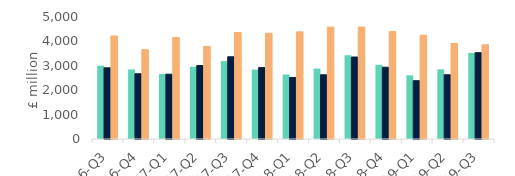
| Category | First-time
buyers | Homemovers | Homowner remortgaging |
|---|---|---|---|
| 16-Q3 | 3006.478 | 2917.918 | 4221.741 |
| 16-Q4 | 2852.368 | 2673.268 | 3658.031 |
| 17-Q1 | 2663.765 | 2655.634 | 4162.385 |
| 17-Q2 | 2962.37 | 3010.336 | 3795.665 |
| 17-Q3 | 3191.685 | 3369.738 | 4363.799 |
| 17-Q4 | 2846.023 | 2926.855 | 4332.96 |
| 18-Q1 | 2642.609 | 2523.005 | 4392.455 |
| 18-Q2 | 2887.583 | 2632.429 | 4586.261 |
| 18-Q3 | 3432.089 | 3360.018 | 4588.237 |
| 18-Q4 | 3043.063 | 2942.697 | 4404.32 |
| 19-Q1 | 2608.874 | 2390.352 | 4253.865 |
| 19-Q2 | 2852.927 | 2632.49 | 3915.24 |
| 19-Q3 | 3529.349 | 3537.454 | 3860.916 |